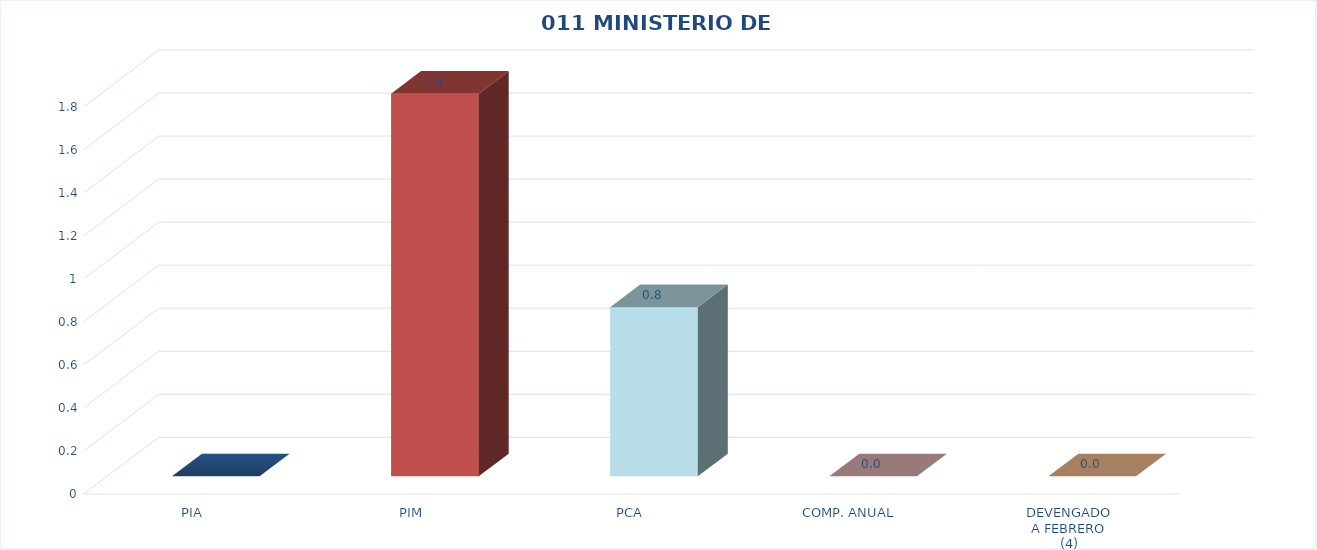
| Category | 011 MINISTERIO DE SALUD |
|---|---|
| PIA | 0 |
| PIM | 1.778 |
| PCA | 0.786 |
| COMP. ANUAL | 0 |
| DEVENGADO
A FEBRERO
(4) | 0 |